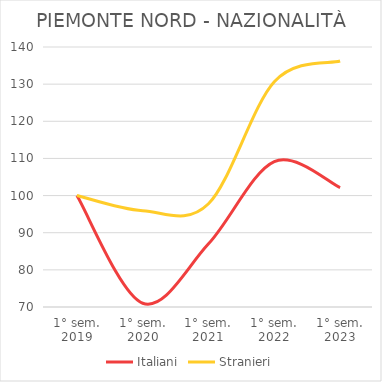
| Category | Italiani | Stranieri |
|---|---|---|
| 1° sem.
2019 | 100 | 100 |
| 1° sem.
2020 | 71.016 | 95.91 |
| 1° sem.
2021 | 87.001 | 97.787 |
| 1° sem.
2022 | 109.158 | 130.663 |
| 1° sem.
2023 | 102.159 | 136.224 |